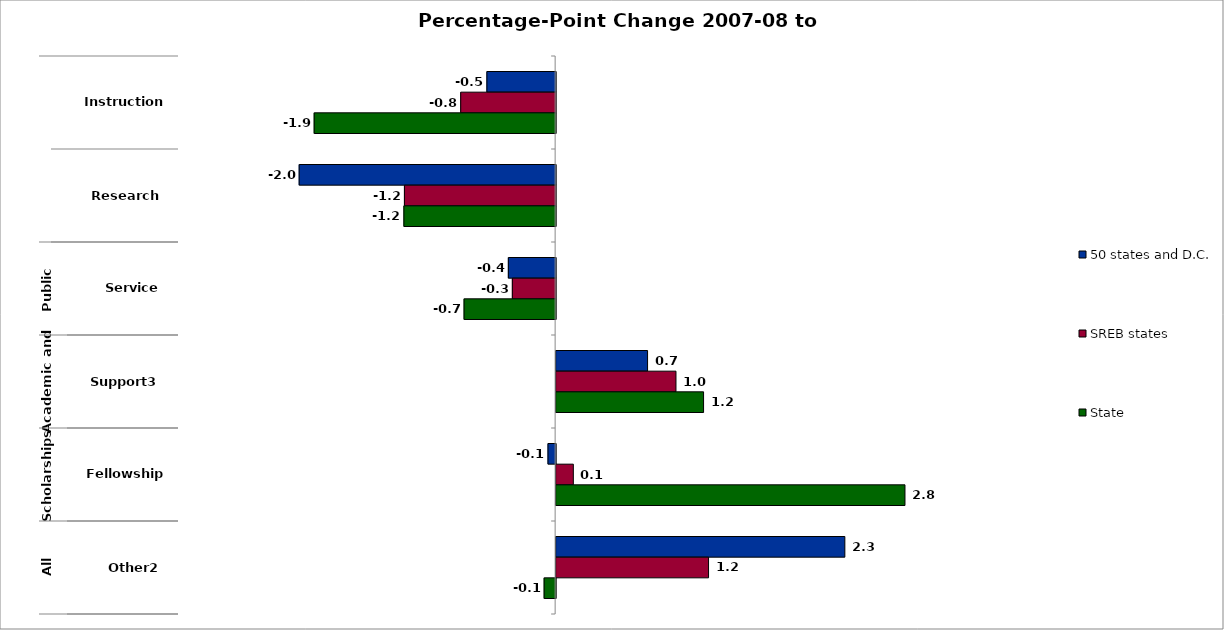
| Category | 50 states and D.C. | SREB states | State |
|---|---|---|---|
| 0 | -0.547 | -0.755 | -1.921 |
| 1 | -2.04 | -1.203 | -1.207 |
| 2 | -0.376 | -0.344 | -0.728 |
| 3 | 0.727 | 0.953 | 1.173 |
| 4 | -0.061 | 0.137 | 2.775 |
| 5 | 2.297 | 1.212 | -0.092 |